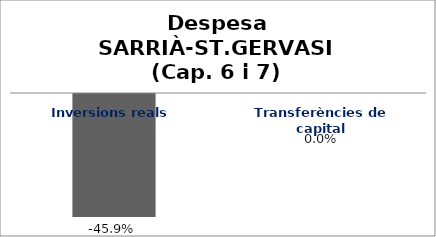
| Category | Series 0 |
|---|---|
| Inversions reals | -0.459 |
| Transferències de capital | 0 |